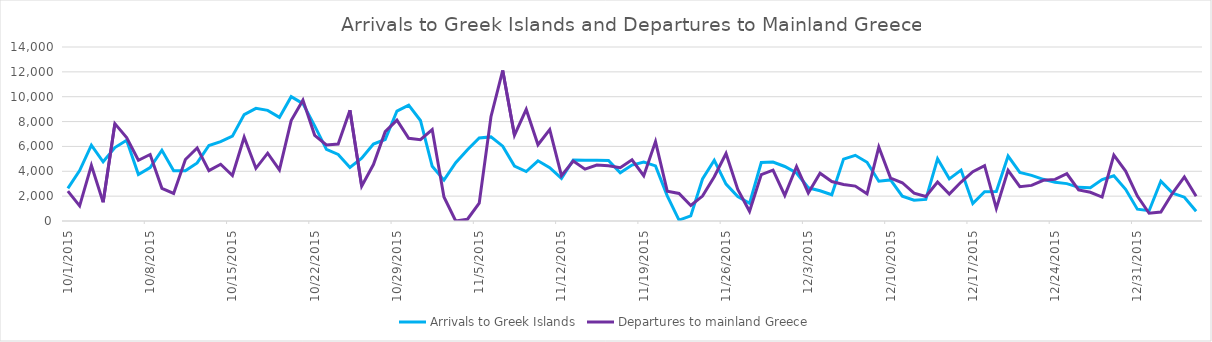
| Category | Arrivals to Greek Islands | Departures to mainland Greece |
|---|---|---|
| 10/1/15 | 2631 | 2409 |
| 10/2/15 | 4055 | 1215 |
| 10/3/15 | 6097 | 4480 |
| 10/4/15 | 4763 | 1513 |
| 10/5/15 | 5909 | 7833 |
| 10/6/15 | 6496 | 6707 |
| 10/7/15 | 3734 | 4886 |
| 10/8/15 | 4295 | 5349 |
| 10/9/15 | 5695 | 2631 |
| 10/10/15 | 4045 | 2214 |
| 10/11/15 | 4034 | 4950 |
| 10/12/15 | 4671 | 5879 |
| 10/13/15 | 6079 | 4052 |
| 10/14/15 | 6380 | 4564 |
| 10/15/15 | 6830 | 3660 |
| 10/16/15 | 8564 | 6743 |
| 10/17/15 | 9063 | 4239 |
| 10/18/15 | 8900 | 5457 |
| 10/19/15 | 8337 | 4119 |
| 10/20/15 | 10006 | 8083 |
| 10/21/15 | 9444 | 9725 |
| 10/22/15 | 7651 | 6896 |
| 10/23/15 | 5762 | 6120 |
| 10/24/15 | 5354 | 6195 |
| 10/25/15 | 4311 | 8916 |
| 10/26/15 | 5049 | 2804 |
| 10/27/15 | 6195 | 4540 |
| 10/28/15 | 6557 | 7191 |
| 10/29/15 | 8847 | 8117 |
| 10/30/15 | 9323 | 6649 |
| 10/31/15 | 8089 | 6537 |
| 11/1/15 | 4400 | 7360 |
| 11/2/15 | 3290 | 1935 |
| 11/3/15 | 4689 | 0 |
| 11/4/15 | 5740 | 142 |
| 11/5/15 | 6679 | 1430 |
| 11/6/15 | 6765 | 8392 |
| 11/7/15 | 6022 | 12116 |
| 11/8/15 | 4425 | 6902 |
| 11/9/15 | 3979 | 8977 |
| 11/10/15 | 4842 | 6133 |
| 11/11/15 | 4296 | 7354 |
| 11/12/15 | 3425 | 3650 |
| 11/13/15 | 4909 | 4820 |
| 11/14/15 | 4884 | 4171 |
| 11/15/15 | 4891 | 4497 |
| 11/16/15 | 4873 | 4442 |
| 11/17/15 | 3873 | 4289 |
| 11/18/15 | 4499 | 4927 |
| 11/19/15 | 4737 | 3644 |
| 11/20/15 | 4432 | 6389 |
| 11/21/15 | 2020 | 2401 |
| 11/22/15 | 76 | 2214 |
| 11/23/15 | 409 | 1245 |
| 11/24/15 | 3383 | 2006 |
| 11/25/15 | 4889 | 3565 |
| 11/26/15 | 2973 | 5435 |
| 11/27/15 | 1961 | 2532 |
| 11/28/15 | 1420 | 778 |
| 11/29/15 | 4703 | 3736 |
| 11/30/15 | 4744 | 4090 |
| 12/1/15 | 4386 | 2057 |
| 12/2/15 | 3863 | 4384 |
| 12/3/15 | 2671 | 2255 |
| 12/4/15 | 2435 | 3844 |
| 12/5/15 | 2110 | 3172 |
| 12/6/15 | 4978 | 2943 |
| 12/7/15 | 5287 | 2810 |
| 12/8/15 | 4721 | 2189 |
| 12/9/15 | 3203 | 5947 |
| 12/10/15 | 3308 | 3456 |
| 12/11/15 | 1999 | 3079 |
| 12/12/15 | 1671 | 2235 |
| 12/13/15 | 1738 | 1976 |
| 12/14/15 | 5005 | 3138 |
| 12/15/15 | 3389 | 2173 |
| 12/16/15 | 4098 | 3137 |
| 12/17/15 | 1402 | 3967 |
| 12/18/15 | 2354 | 4458 |
| 12/19/15 | 2373 | 1016 |
| 12/20/15 | 5223 | 4070 |
| 12/21/15 | 3904 | 2757 |
| 12/22/15 | 3668 | 2864 |
| 12/23/15 | 3354 | 3278 |
| 12/24/15 | 3110 | 3349 |
| 12/25/15 | 3008 | 3801 |
| 12/26/15 | 2710 | 2498 |
| 12/27/15 | 2678 | 2311 |
| 12/28/15 | 3337 | 1924 |
| 12/29/15 | 3643 | 5309 |
| 12/30/15 | 2552 | 4021 |
| 12/31/15 | 948 | 2009 |
| 1/1/16 | 828 | 623 |
| 1/2/16 | 3203 | 720 |
| 1/3/16 | 2241 | 2249 |
| 1/4/16 | 1917 | 3549 |
| 1/5/16 | 779 | 1998 |